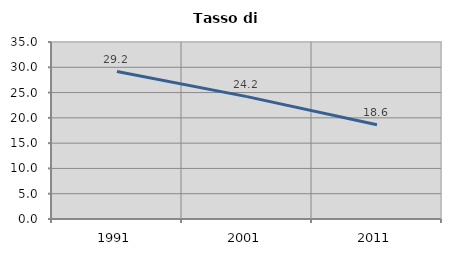
| Category | Tasso di disoccupazione   |
|---|---|
| 1991.0 | 29.167 |
| 2001.0 | 24.194 |
| 2011.0 | 18.644 |